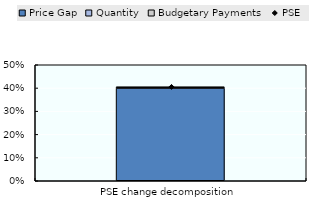
| Category | Price Gap | Quantity | Budgetary Payments |
|---|---|---|---|
| PSE change decomposition | 0.4 | 0.001 | 0.005 |